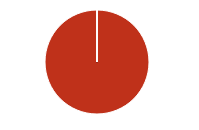
| Category | Total |
|---|---|
| Y | 0 |
| R | 0 |
| T | 0 |
| M | 0 |
| F | 0 |
| N | 114 |